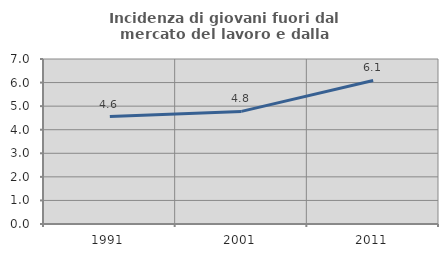
| Category | Incidenza di giovani fuori dal mercato del lavoro e dalla formazione  |
|---|---|
| 1991.0 | 4.558 |
| 2001.0 | 4.777 |
| 2011.0 | 6.089 |